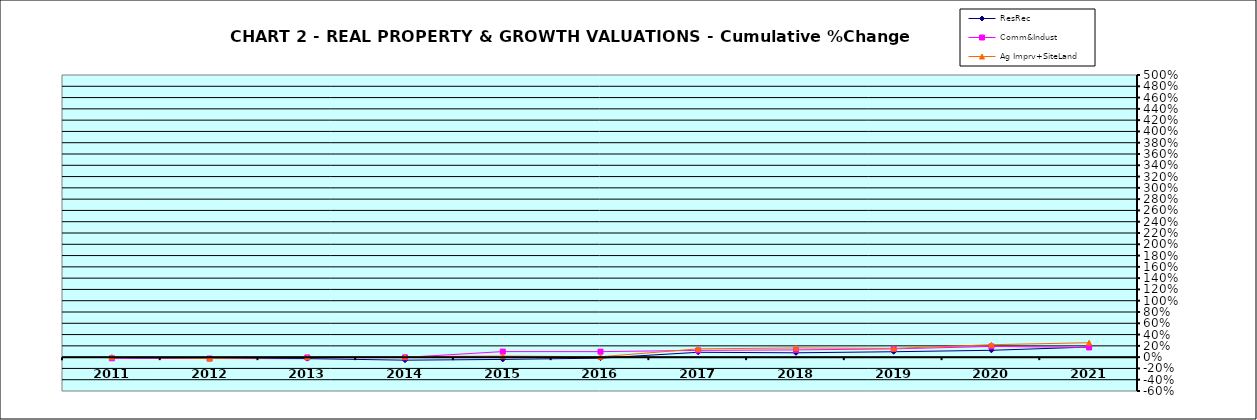
| Category | ResRec | Comm&Indust | Ag Imprv+SiteLand |
|---|---|---|---|
| 2011.0 | -0.005 | -0.02 | 0 |
| 2012.0 | -0.024 | -0.024 | -0.025 |
| 2013.0 | -0.026 | -0.006 | 0 |
| 2014.0 | -0.054 | -0.004 | 0.009 |
| 2015.0 | -0.04 | 0.098 | 0.019 |
| 2016.0 | -0.018 | 0.098 | 0.007 |
| 2017.0 | 0.086 | 0.12 | 0.147 |
| 2018.0 | 0.077 | 0.129 | 0.163 |
| 2019.0 | 0.096 | 0.147 | 0.155 |
| 2020.0 | 0.121 | 0.19 | 0.22 |
| 2021.0 | 0.179 | 0.172 | 0.256 |